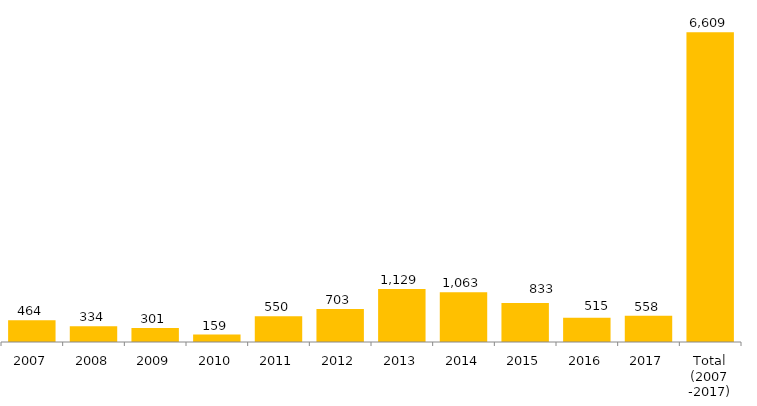
| Category | Total Geral |
|---|---|
| 2007 | 464 |
| 2008 | 334 |
| 2009 | 301 |
| 2010 | 159 |
| 2011 | 550 |
| 2012 | 703 |
| 2013 | 1129 |
| 2014 | 1063 |
| 2015 | 833 |
| 2016 | 515 |
| 2017 | 558 |
| Total (2007 -2017) | 6609 |